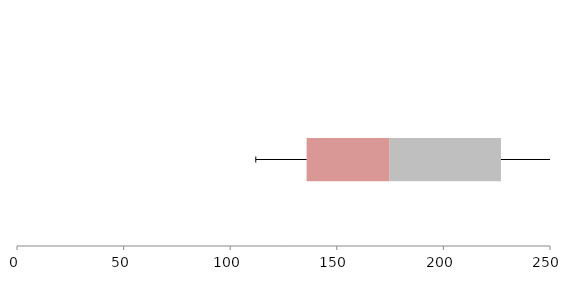
| Category | Series 1 | Series 2 | Series 3 |
|---|---|---|---|
| 0 | 135.835 | 38.952 | 52.2 |